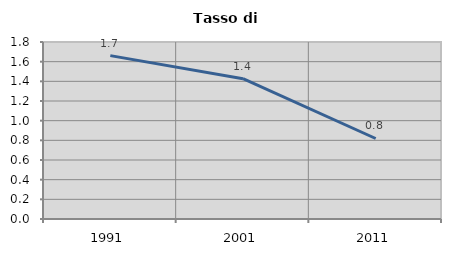
| Category | Tasso di disoccupazione   |
|---|---|
| 1991.0 | 1.662 |
| 2001.0 | 1.427 |
| 2011.0 | 0.819 |